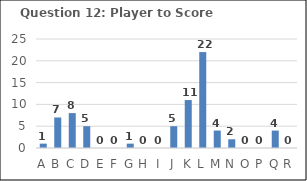
| Category | Series 0 |
|---|---|
| A | 1 |
| B | 7 |
| C | 8 |
| D | 5 |
| E | 0 |
| F | 0 |
| G | 1 |
| H | 0 |
| I | 0 |
| J | 5 |
| K | 11 |
| L | 22 |
| M | 4 |
| N | 2 |
| O | 0 |
| P | 0 |
| Q | 4 |
| R | 0 |